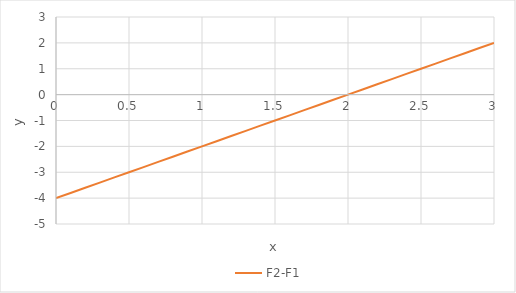
| Category | F2-F1 |
|---|---|
| 0.0 | -4 |
| 0.1 | -3.8 |
| 0.2 | -3.6 |
| 0.30000000000000004 | -3.4 |
| 0.4 | -3.2 |
| 0.5 | -3 |
| 0.6 | -2.8 |
| 0.7 | -2.6 |
| 0.7999999999999999 | -2.4 |
| 0.8999999999999999 | -2.2 |
| 0.9999999999999999 | -2 |
| 1.0999999999999999 | -1.8 |
| 1.2 | -1.6 |
| 1.3 | -1.4 |
| 1.4000000000000001 | -1.2 |
| 1.5000000000000002 | -1 |
| 1.6000000000000003 | -0.8 |
| 1.7000000000000004 | -0.6 |
| 1.8000000000000005 | -0.4 |
| 1.9000000000000006 | -0.2 |
| 2.0000000000000004 | 0 |
| 2.1000000000000005 | 0.2 |
| 2.2000000000000006 | 0.4 |
| 2.3000000000000007 | 0.6 |
| 2.400000000000001 | 0.8 |
| 2.500000000000001 | 1 |
| 2.600000000000001 | 1.2 |
| 2.700000000000001 | 1.4 |
| 2.800000000000001 | 1.6 |
| 2.9000000000000012 | 1.8 |
| 3.0000000000000013 | 2 |